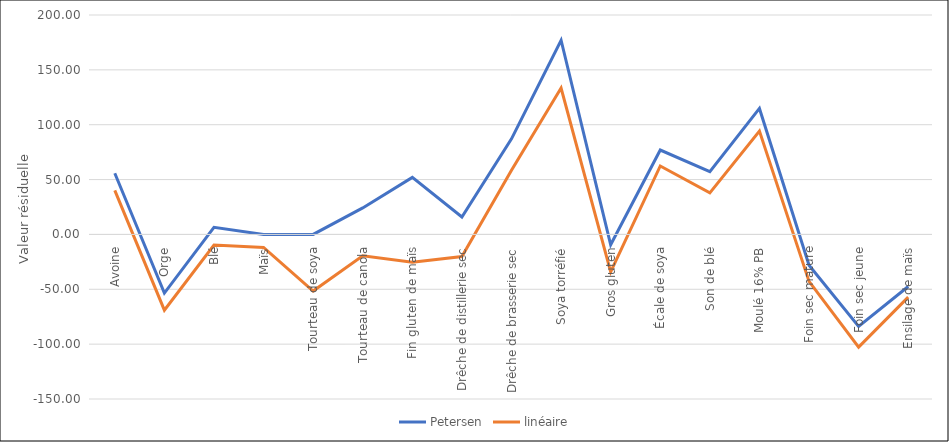
| Category | Petersen | linéaire |
|---|---|---|
| Avoine | 55.76 | 40.192 |
| Orge | -53.42 | -69.026 |
| Blé | 6.443 | -9.698 |
| Maïs | 0 | -11.902 |
| Tourteau de soya | 0 | -51.61 |
| Tourteau de canola | 24.152 | -19.385 |
| Fin gluten de maïs | 51.986 | -25.411 |
| Drêche de distillerie sec | 15.894 | -20.207 |
| Drêche de brasserie sec | 87.089 | 58.485 |
| Soya torréfié | 177.01 | 133.438 |
| Gros gluten | -9.461 | -34.236 |
| Écale de soya | 76.926 | 62.401 |
| Son de blé | 57.222 | 37.888 |
| Moulé 16% PB | 114.834 | 94.284 |
| Foin sec mature | -28.07 | -42.778 |
| Foin sec jeune | -83.911 | -102.758 |
| Ensilage de maïs | -47.44 | -57.138 |